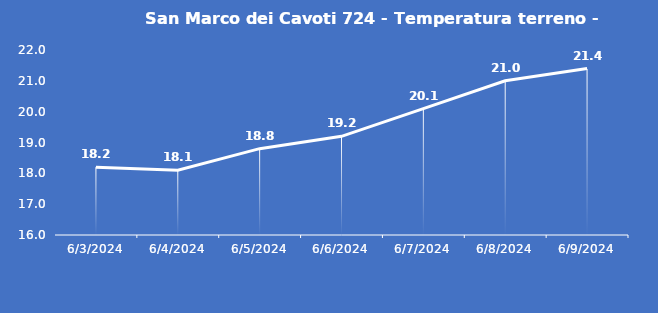
| Category | San Marco dei Cavoti 724 - Temperatura terreno - Grezzo (°C) |
|---|---|
| 6/3/24 | 18.2 |
| 6/4/24 | 18.1 |
| 6/5/24 | 18.8 |
| 6/6/24 | 19.2 |
| 6/7/24 | 20.1 |
| 6/8/24 | 21 |
| 6/9/24 | 21.4 |